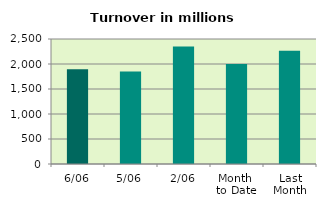
| Category | Series 0 |
|---|---|
| 6/06 | 1894.384 |
| 5/06 | 1852.441 |
| 2/06 | 2350.115 |
| Month 
to Date | 1998.582 |
| Last
Month | 2265.206 |